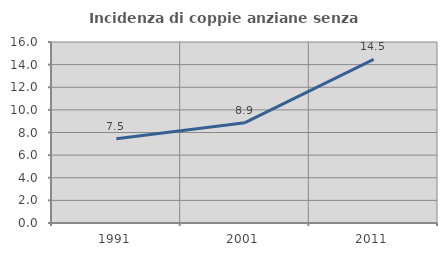
| Category | Incidenza di coppie anziane senza figli  |
|---|---|
| 1991.0 | 7.457 |
| 2001.0 | 8.866 |
| 2011.0 | 14.467 |